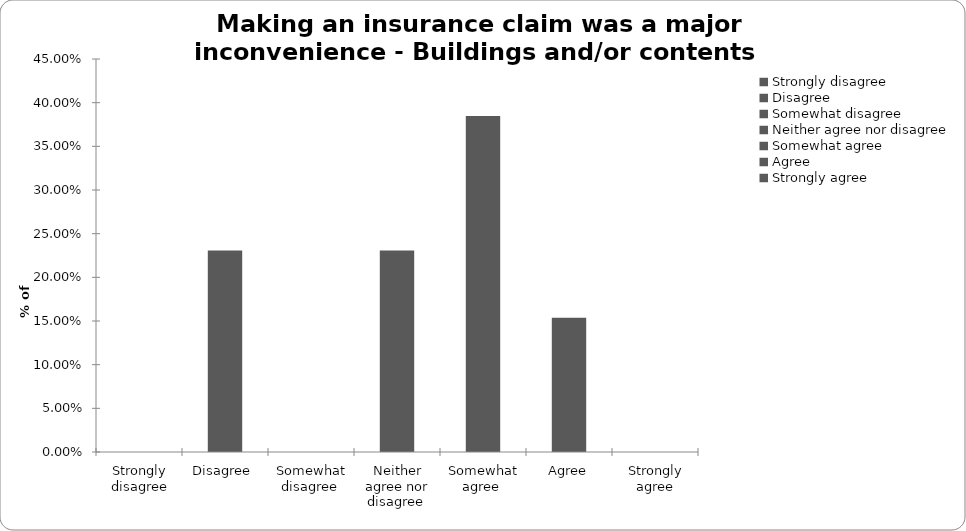
| Category | Series 1 |
|---|---|
| Strongly disagree | 0 |
| Disagree  | 0.231 |
| Somewhat disagree  | 0 |
| Neither agree nor disagree  | 0.231 |
| Somewhat agree  | 0.385 |
| Agree | 0.154 |
| Strongly agree | 0 |